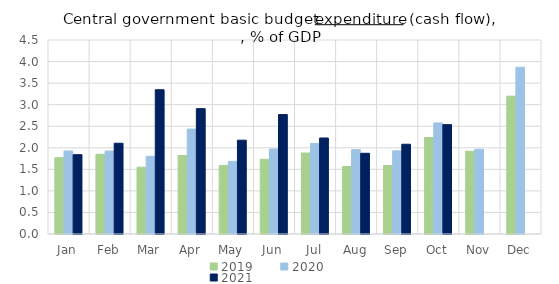
| Category | 2019 | 2020 | 2021 |
|---|---|---|---|
| Jan | 1.77 | 1.925 | 1.84 |
| Feb | 1.849 | 1.924 | 2.105 |
| Mar | 1.549 | 1.802 | 3.346 |
| Apr | 1.822 | 2.434 | 2.908 |
| May | 1.591 | 1.686 | 2.176 |
| Jun | 1.731 | 1.971 | 2.771 |
| Jul | 1.878 | 2.101 | 2.227 |
| Aug | 1.566 | 1.956 | 1.872 |
| Sep | 1.59 | 1.929 | 2.082 |
| Oct | 2.239 | 2.577 | 2.537 |
| Nov | 1.92 | 1.966 | 0 |
| Dec | 3.197 | 3.867 | 0 |